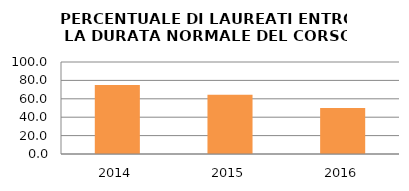
| Category | 2014 2015 2016 |
|---|---|
| 2014.0 | 75 |
| 2015.0 | 64.286 |
| 2016.0 | 50 |